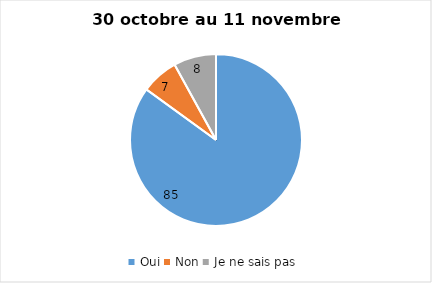
| Category | Series 0 |
|---|---|
| Oui | 85 |
| Non | 7 |
| Je ne sais pas | 8 |